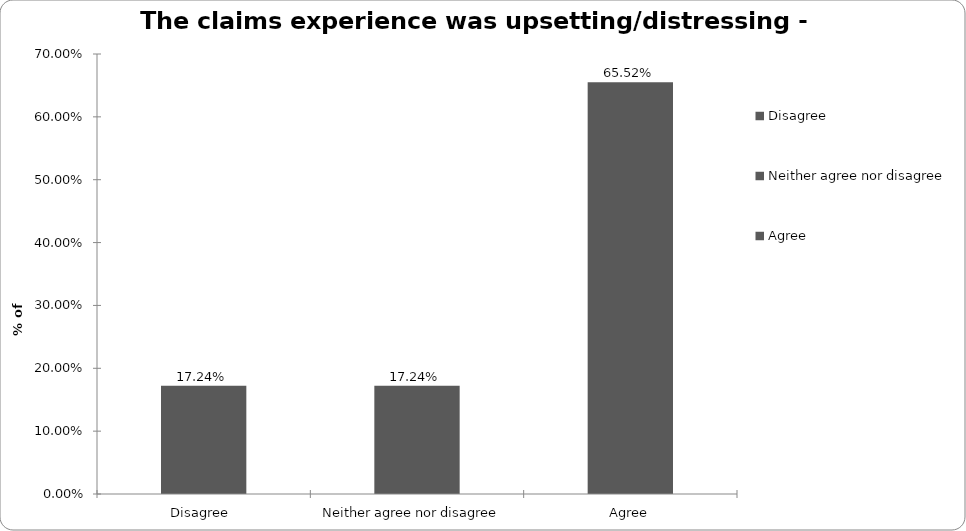
| Category | Motor |
|---|---|
| Disagree  | 0.172 |
| Neither agree nor disagree  | 0.172 |
| Agree | 0.655 |